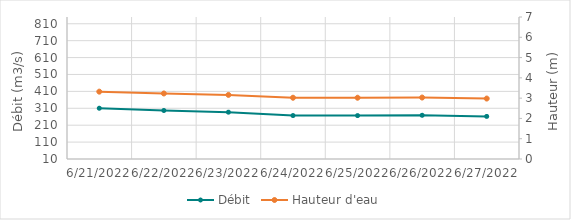
| Category | Débit |
|---|---|
| 4/26/22 | 674.08 |
| 4/25/22 | 724.92 |
| 4/24/22 | 758.58 |
| 4/23/22 | 781.98 |
| 4/22/22 | 785.46 |
| 4/21/22 | 560.3 |
| 4/20/22 | 503.89 |